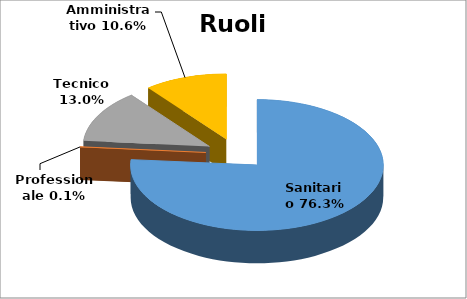
| Category | Series 0 |
|---|---|
| Sanitario | 0.763 |
| Professionale | 0.001 |
| Tecnico | 0.13 |
| Amministrativo | 0.106 |